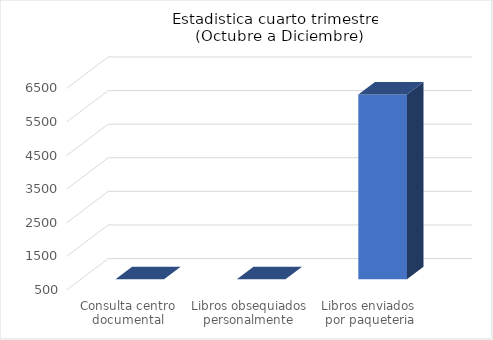
| Category | Enero a Marzo |
|---|---|
| Consulta centro documental | 0 |
| Libros obsequiados personalmente | 0 |
| Libros enviados  por paqueteria | 6000 |